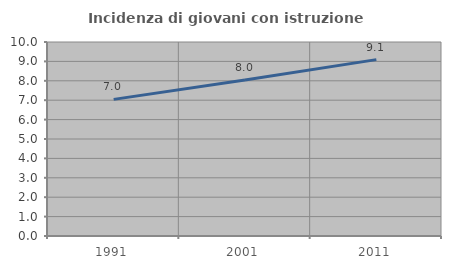
| Category | Incidenza di giovani con istruzione universitaria |
|---|---|
| 1991.0 | 7.042 |
| 2001.0 | 8.046 |
| 2011.0 | 9.091 |